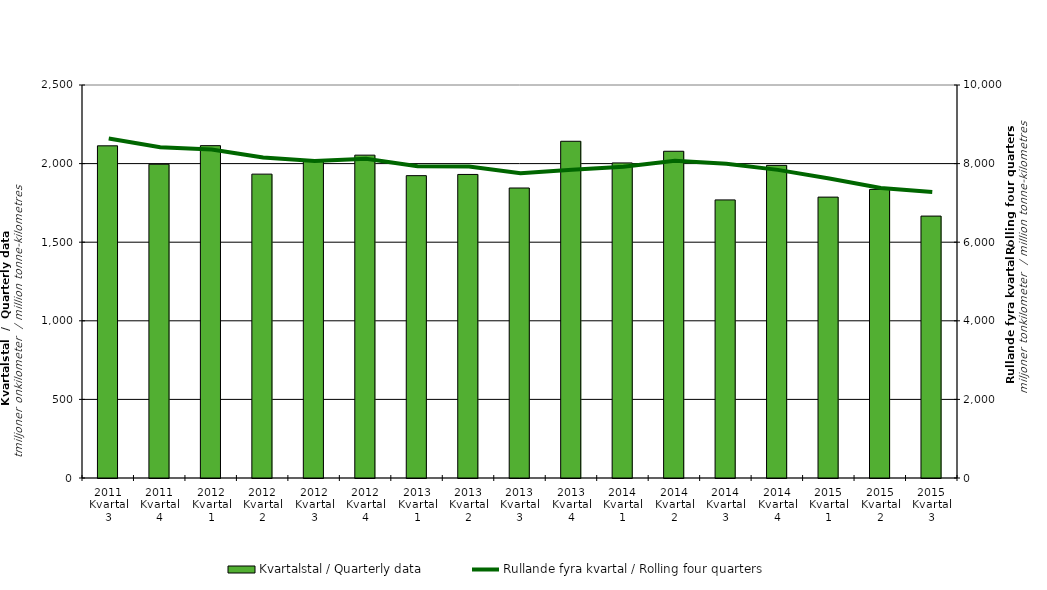
| Category | Kvartalstal / Quarterly data |
|---|---|
| 2011 Kvartal 3 | 2113.105 |
| 2011 Kvartal 4 | 1995.897 |
| 2012 Kvartal 1 | 2114.225 |
| 2012 Kvartal 2 | 1932.987 |
| 2012 Kvartal 3 | 2020.1 |
| 2012 Kvartal 4 | 2053.722 |
| 2013 Kvartal 1 | 1923.402 |
| 2013 Kvartal 2 | 1931.023 |
| 2013 Kvartal 3 | 1844.768 |
| 2013 Kvartal 4 | 2142.032 |
| 2014 Kvartal 1 | 2004.251 |
| 2014 Kvartal 2 | 2078.529 |
| 2014 Kvartal 3 | 1768.998 |
| 2014 Kvartal 4 | 1988.83 |
| 2015 Kvartal 1 | 1786.831 |
| 2015 Kvartal 2 | 1835.711 |
| 2015 Kvartal 3 | 1666.152 |